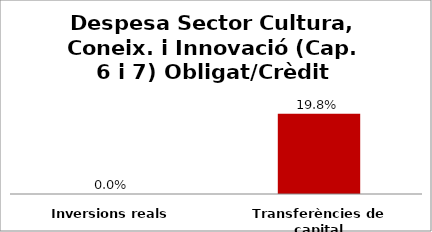
| Category | Series 0 |
|---|---|
| Inversions reals | 0 |
| Transferències de capital | 0.198 |